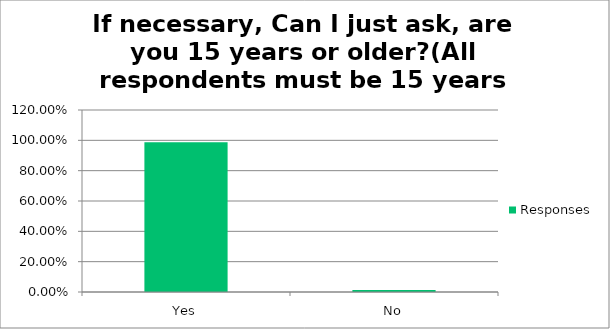
| Category | Responses |
|---|---|
| Yes | 0.988 |
| No | 0.012 |